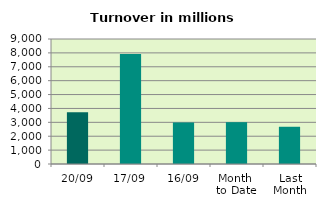
| Category | Series 0 |
|---|---|
| 20/09 | 3721.05 |
| 17/09 | 7920.4 |
| 16/09 | 2991.009 |
| Month 
to Date | 3012.306 |
| Last
Month | 2681.097 |